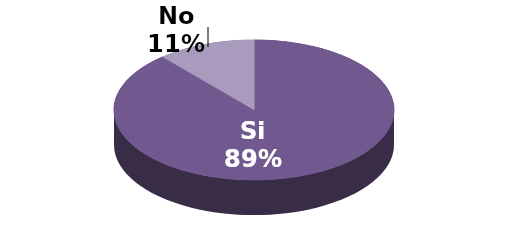
| Category | Series 1 |
|---|---|
| Si | 172 |
| No | 22 |